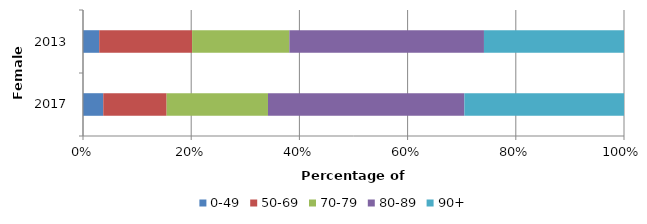
| Category | 0-49 | 50-69 | 70-79 | 80-89 | 90+ |
|---|---|---|---|---|---|
| 2017.0 | 16 | 50 | 80 | 155 | 126 |
| 2013.0 | 11 | 63 | 66 | 132 | 95 |